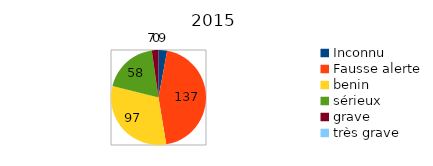
| Category | Series 0 |
|---|---|
| Inconnu | 9 |
| Fausse alerte | 137 |
| benin | 97 |
| sérieux | 58 |
| grave | 7 |
| très grave | 0 |